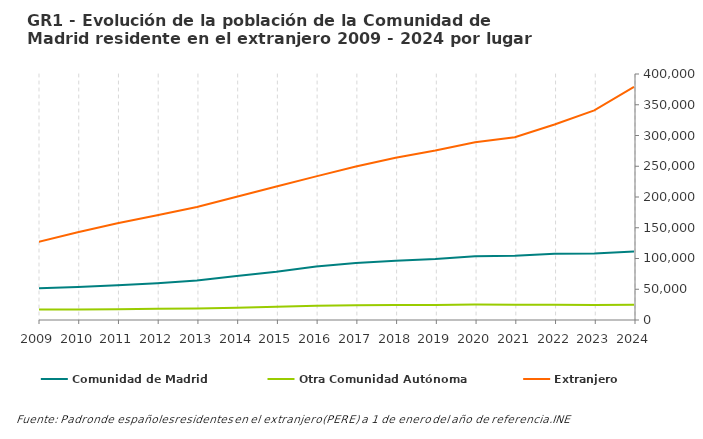
| Category | Comunidad de Madrid | Otra Comunidad Autónoma | Extranjero |
|---|---|---|---|
| 2024.0 | 111344 | 24753 | 378996 |
| 2023.0 | 108000 | 24387 | 340880 |
| 2022.0 | 107664 | 24962 | 317795 |
| 2021.0 | 104479 | 24896 | 297090 |
| 2020.0 | 103550 | 25234 | 289140 |
| 2019.0 | 99165 | 24564 | 275595 |
| 2018.0 | 96437 | 24443 | 263753 |
| 2017.0 | 92814 | 24119 | 249644 |
| 2016.0 | 87017 | 23122 | 233520 |
| 2015.0 | 78433 | 21470 | 216962 |
| 2014.0 | 71457 | 20114 | 200264 |
| 2013.0 | 64330 | 18826 | 183827 |
| 2012.0 | 59882 | 18178 | 170457 |
| 2011.0 | 56563 | 17483 | 157266 |
| 2010.0 | 53778 | 17112 | 142740 |
| 2009.0 | 51620 | 16891 | 126792 |